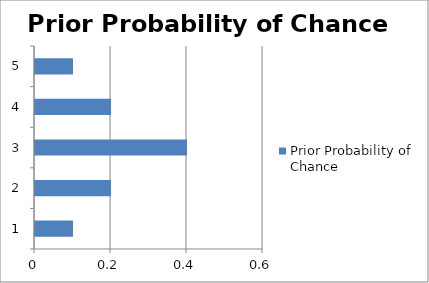
| Category | Prior Probability of Chance |
|---|---|
| 0 | 0.1 |
| 1 | 0.2 |
| 2 | 0.4 |
| 3 | 0.2 |
| 4 | 0.1 |